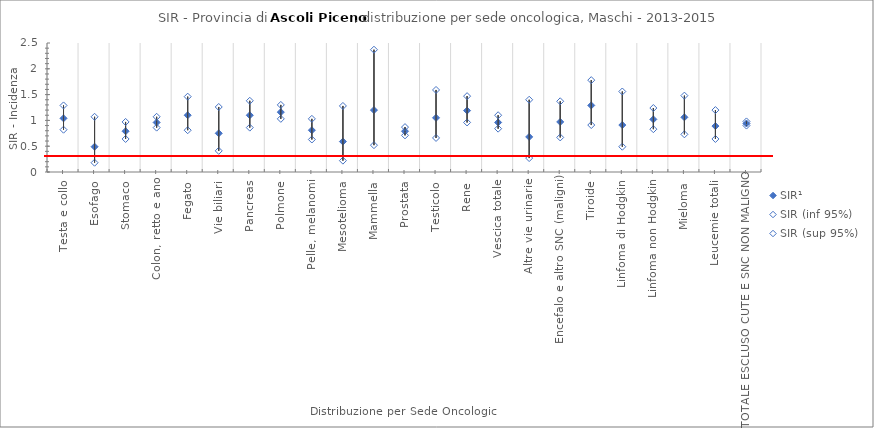
| Category | SIR¹ | SIR (inf 95%) | SIR (sup 95%) |
|---|---|---|---|
| Testa e collo | 1.04 | 0.82 | 1.29 |
| Esofago | 0.49 | 0.18 | 1.07 |
| Stomaco | 0.79 | 0.64 | 0.97 |
| Colon, retto e ano | 0.96 | 0.86 | 1.07 |
| Fegato | 1.1 | 0.81 | 1.46 |
| Vie biliari | 0.75 | 0.41 | 1.26 |
| Pancreas | 1.1 | 0.86 | 1.38 |
| Polmone | 1.16 | 1.03 | 1.3 |
| Pelle, melanomi | 0.81 | 0.63 | 1.03 |
| Mesotelioma | 0.59 | 0.22 | 1.28 |
| Mammella | 1.2 | 0.52 | 2.37 |
| Prostata | 0.79 | 0.71 | 0.87 |
| Testicolo | 1.05 | 0.66 | 1.59 |
| Rene | 1.19 | 0.96 | 1.47 |
| Vescica totale | 0.96 | 0.84 | 1.1 |
| Altre vie urinarie | 0.68 | 0.27 | 1.4 |
| Encefalo e altro SNC (maligni) | 0.97 | 0.67 | 1.37 |
| Tiroide | 1.29 | 0.91 | 1.78 |
| Linfoma di Hodgkin | 0.91 | 0.49 | 1.56 |
| Linfoma non Hodgkin | 1.02 | 0.83 | 1.24 |
| Mieloma | 1.06 | 0.73 | 1.48 |
| Leucemie totali | 0.89 | 0.64 | 1.2 |
| TOTALE ESCLUSO CUTE E SNC NON MALIGNO | 0.94 | 0.9 | 0.98 |